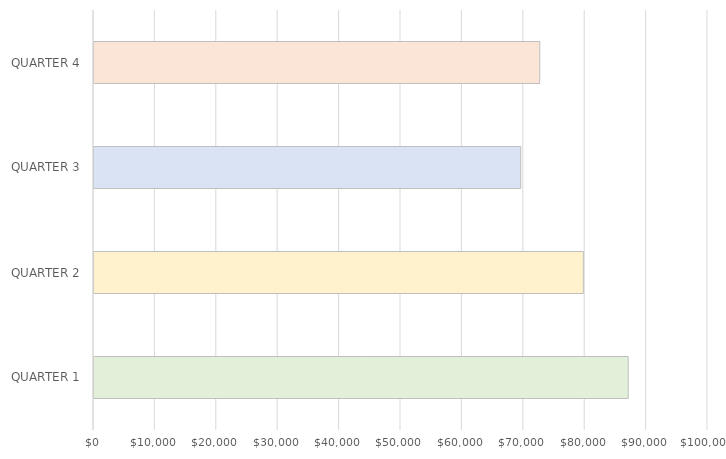
| Category | Series 0 |
|---|---|
| QUARTER 1 | 87000 |
| QUARTER 2 | 79700 |
| QUARTER 3 | 69500 |
| QUARTER 4 | 72600 |